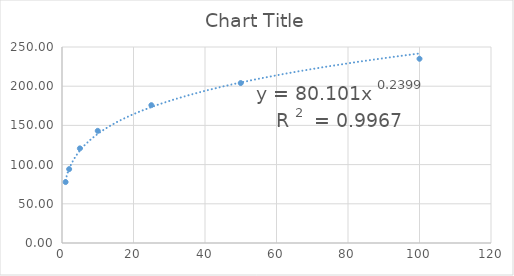
| Category | Series 0 |
|---|---|
| 1.0 | 77.742 |
| 2.0 | 94.256 |
| 5.0 | 120.678 |
| 10.0 | 143.036 |
| 25.0 | 175.81 |
| 50.0 | 204.01 |
| 100.0 | 235.005 |